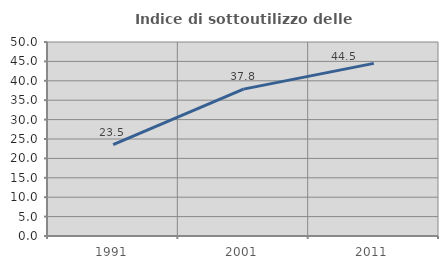
| Category | Indice di sottoutilizzo delle abitazioni  |
|---|---|
| 1991.0 | 23.529 |
| 2001.0 | 37.849 |
| 2011.0 | 44.489 |